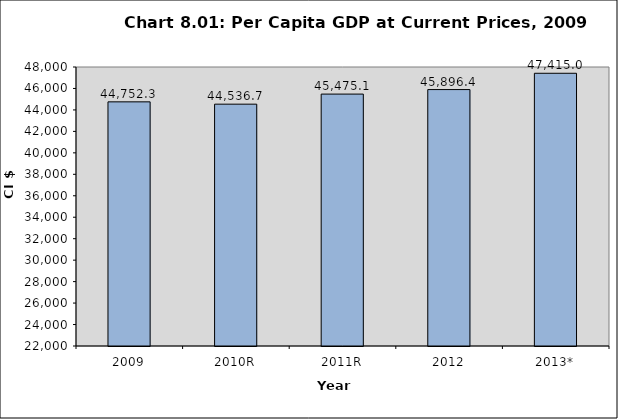
| Category | Series 0 |
|---|---|
| 2009 | 44752.318 |
| 2010R | 44536.662 |
| 2011R | 45475.136 |
| 2012 | 45896.396 |
| 2013* | 47415 |